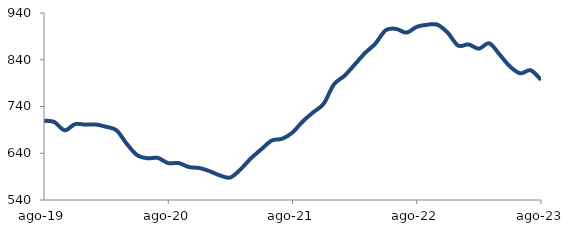
| Category | Series 0 |
|---|---|
| 2019-08-01 | 709.635 |
| 2019-09-01 | 706.734 |
| 2019-10-01 | 689.137 |
| 2019-11-01 | 702.277 |
| 2019-12-01 | 701.214 |
| 2020-01-01 | 701.517 |
| 2020-02-01 | 696.552 |
| 2020-03-01 | 689.099 |
| 2020-04-01 | 659.896 |
| 2020-05-01 | 635.894 |
| 2020-06-01 | 629.29 |
| 2020-07-01 | 629.994 |
| 2020-08-01 | 618.866 |
| 2020-09-01 | 619.022 |
| 2020-10-01 | 610.428 |
| 2020-11-01 | 608.402 |
| 2020-12-01 | 601.605 |
| 2021-01-01 | 592.504 |
| 2021-02-01 | 588.185 |
| 2021-03-01 | 605.989 |
| 2021-04-01 | 629.446 |
| 2021-05-01 | 648.73 |
| 2021-06-01 | 667.177 |
| 2021-07-01 | 670.996 |
| 2021-08-01 | 684.389 |
| 2021-09-01 | 708.308 |
| 2021-10-01 | 727.608 |
| 2021-11-01 | 745.65 |
| 2021-12-01 | 787.184 |
| 2022-01-01 | 805.308 |
| 2022-02-01 | 829.502 |
| 2022-03-01 | 854.336 |
| 2022-04-01 | 874.453 |
| 2022-05-01 | 903.049 |
| 2022-06-01 | 906.022 |
| 2022-07-01 | 898.071 |
| 2022-08-01 | 910.353 |
| 2022-09-01 | 914.859 |
| 2022-10-01 | 914.857 |
| 2022-11-01 | 897.607 |
| 2022-12-01 | 870.196 |
| 2023-01-01 | 872.784 |
| 2023-02-01 | 863.736 |
| 2023-03-01 | 875.118 |
| 2023-04-01 | 851.276 |
| 2023-05-01 | 825.667 |
| 2023-06-01 | 810.924 |
| 2023-07-01 | 817.469 |
| 2023-08-01 | 797.001 |